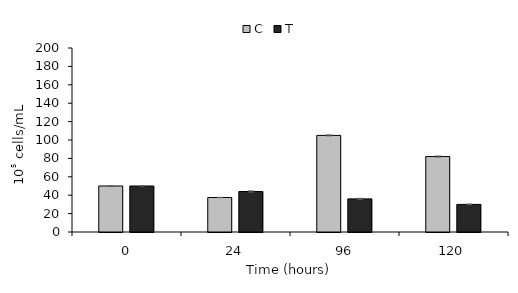
| Category | C | T |
|---|---|---|
| 0.0 | 50 | 50 |
| 24.0 | 37.5 | 44 |
| 96.0 | 105 | 36 |
| 120.0 | 82 | 30 |